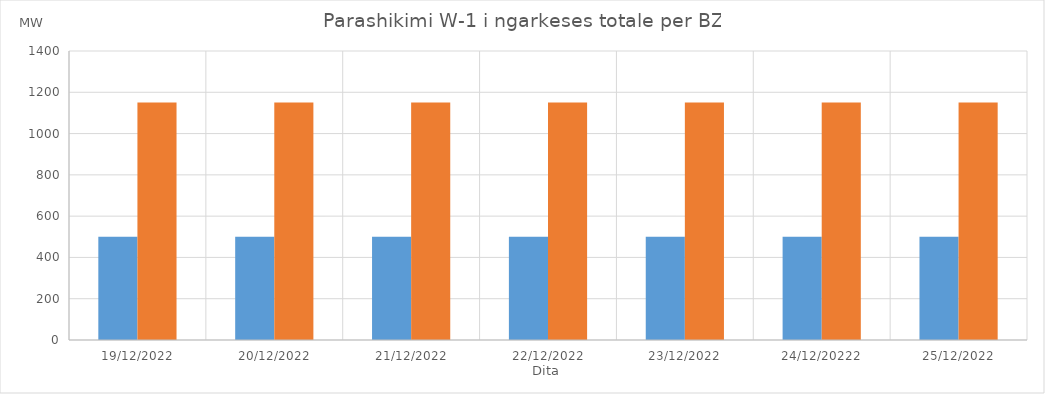
| Category | Min (MW) | Max (MW) |
|---|---|---|
| 19/12/2022 | 500 | 1150 |
| 20/12/2022 | 500 | 1150 |
| 21/12/2022 | 500 | 1150 |
| 22/12/2022 | 500 | 1150 |
| 23/12/2022 | 500 | 1150 |
| 24/12/20222 | 500 | 1150 |
| 25/12/2022 | 500 | 1150 |